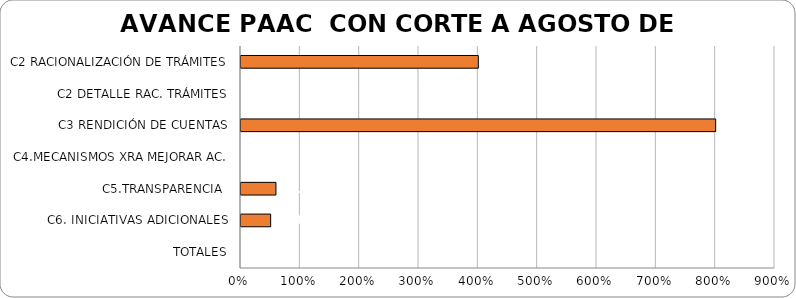
| Category | % AVANCE |
|---|---|
| C2 RACIONALIZACIÓN DE TRÁMITES | 4 |
| C2 DETALLE RAC. TRÁMITES | 0 |
| C3 RENDICIÓN DE CUENTAS | 8 |
| C4.MECANISMOS XRA MEJORAR AC. | 0 |
| C5.TRANSPARENCIA  | 0.589 |
| C6. INICIATIVAS ADICIONALES | 0.5 |
| TOTALES | 0 |